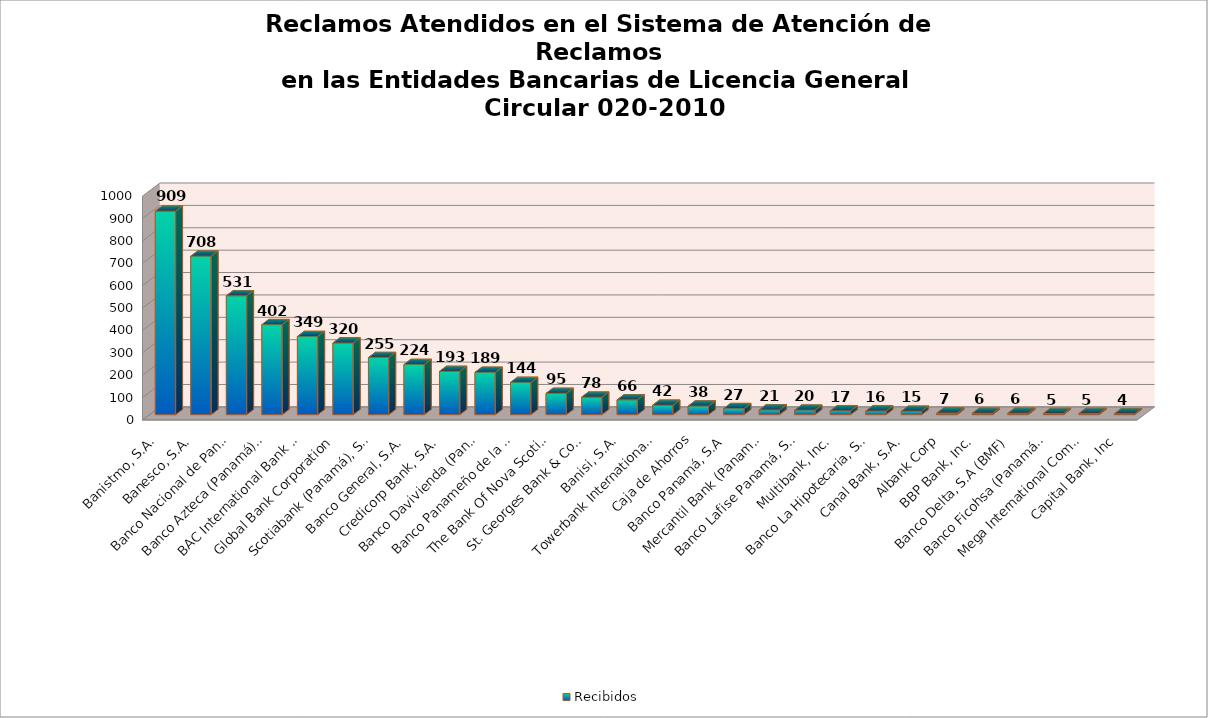
| Category | Recibidos |
|---|---|
| Banistmo, S.A. | 909 |
| Banesco, S.A. | 708 |
| Banco Nacional de Panamá | 531 |
| Banco Azteca (Panamá), S.A | 402 |
| BAC International Bank Inc | 349 |
| Global Bank Corporation | 320 |
| Scotiabank (Panamá), S.A.) | 255 |
| Banco General, S.A. | 224 |
| Credicorp Bank, S.A. | 193 |
| Banco Davivienda (Panamá), S.A | 189 |
| Banco Panameño de la  Vivienda, S.A. | 144 |
| The Bank Of Nova Scotia  | 95 |
| St. Georges Bank & Company, Inc. | 78 |
| Banisi, S.A. | 66 |
| Towerbank International, Inc. | 42 |
| Caja de Ahorros | 38 |
| Banco Panamá, S.A | 27 |
| Mercantil Bank (Panamá), S.A. | 21 |
| Banco Lafise Panamá, S.A. | 20 |
| Multibank, Inc. | 17 |
| Banco La Hipotecaria, S.A | 16 |
| Canal Bank, S.A. | 15 |
| Albank Corp | 7 |
| BBP Bank, Inc. | 6 |
| Banco Delta, S.A (BMF) | 6 |
| Banco Ficohsa (Panamá), S.A. | 5 |
| Mega International Commercial Bank co. | 5 |
| Capital Bank, Inc | 4 |